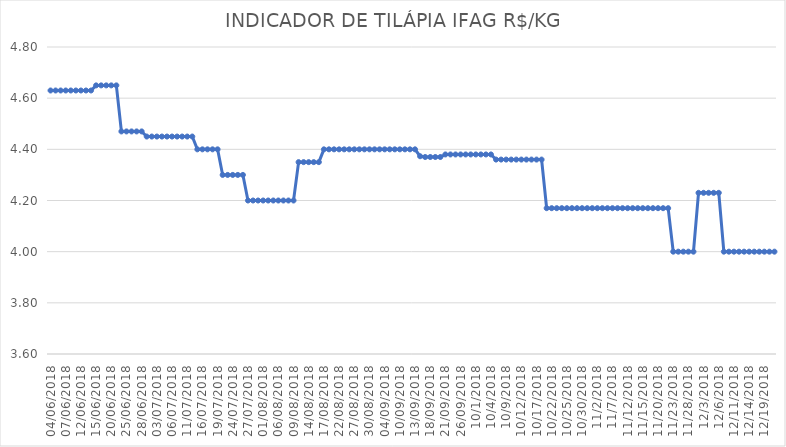
| Category | INDICADOR DE TILÁPIA IFAG |
|---|---|
| 04/06/2018 | 4.63 |
| 05/06/2018 | 4.63 |
| 06/06/2018 | 4.63 |
| 07/06/2018 | 4.63 |
| 08/06/2018 | 4.63 |
| 11/06/2018 | 4.63 |
| 12/06/2018 | 4.63 |
| 13/06/2018 | 4.63 |
| 14/06/2018 | 4.63 |
| 15/06/2018 | 4.65 |
| 18/06/2018 | 4.65 |
| 19/06/2018 | 4.65 |
| 20/06/2018 | 4.65 |
| 21/06/2018 | 4.65 |
| 22/06/2018 | 4.47 |
| 25/06/2018 | 4.47 |
| 26/06/2018 | 4.47 |
| 27/06/2018 | 4.47 |
| 28/06/2018 | 4.47 |
| 29/06/2018 | 4.45 |
| 02/07/2018 | 4.45 |
| 03/07/2018 | 4.45 |
| 04/07/2018 | 4.45 |
| 05/07/2018 | 4.45 |
| 06/07/2018 | 4.45 |
| 09/07/2018 | 4.45 |
| 10/07/2018 | 4.45 |
| 11/07/2018 | 4.45 |
| 12/07/2018 | 4.45 |
| 13/07/2018 | 4.4 |
| 16/07/2018 | 4.4 |
| 17/07/2018 | 4.4 |
| 18/07/2018 | 4.4 |
| 19/07/2018 | 4.4 |
| 20/07/2018 | 4.3 |
| 23/07/2018 | 4.3 |
| 24/07/2018 | 4.3 |
| 25/07/2018 | 4.3 |
| 26/07/2018 | 4.3 |
| 27/07/2018 | 4.2 |
| 30/07/2018 | 4.2 |
| 31/07/2018 | 4.2 |
| 01/08/2018 | 4.2 |
| 02/08/2018 | 4.2 |
| 03/08/2018 | 4.2 |
| 06/08/2018 | 4.2 |
| 07/08/2018 | 4.2 |
| 08/08/2018 | 4.2 |
| 09/08/2018 | 4.2 |
| 10/08/2018 | 4.35 |
| 13/08/2018 | 4.35 |
| 14/08/2018 | 4.35 |
| 15/08/2018 | 4.35 |
| 16/08/2018 | 4.35 |
| 17/08/2018 | 4.4 |
| 20/08/2018 | 4.4 |
| 21/08/2018 | 4.4 |
| 22/08/2018 | 4.4 |
| 23/08/2018 | 4.4 |
| 24/08/2018 | 4.4 |
| 27/08/2018 | 4.4 |
| 28/08/2018 | 4.4 |
| 29/08/2018 | 4.4 |
| 30/08/2018 | 4.4 |
| 31/08/2018 | 4.4 |
| 03/09/2018 | 4.4 |
| 04/09/2018 | 4.4 |
| 05/09/2018 | 4.4 |
| 06/09/2018 | 4.4 |
| 10/09/2018 | 4.4 |
| 11/09/2018 | 4.4 |
| 12/09/2018 | 4.4 |
| 13/09/2018 | 4.4 |
| 14/09/2018 | 4.373 |
| 17/09/2018 | 4.37 |
| 18/09/2018 | 4.37 |
| 19/09/2018 | 4.37 |
| 20/09/2018 | 4.37 |
| 21/09/2018 | 4.38 |
| 24/09/2018 | 4.38 |
| 25/09/2018 | 4.38 |
| 26/09/2018 | 4.38 |
| 27/09/2018 | 4.38 |
| 28/09/2018 | 4.38 |
| 01/10/2018 | 4.38 |
| 02/10/2018 | 4.38 |
| 03/10/2018 | 4.38 |
| 04/10/2018 | 4.38 |
| 05/10/2018 | 4.36 |
| 08/10/2018 | 4.36 |
| 09/10/2018 | 4.36 |
| 10/10/2018 | 4.36 |
| 11/10/2018 | 4.36 |
| 12/10/2018 | 4.36 |
| 15/10/2018 | 4.36 |
| 16/10/2018 | 4.36 |
| 17/10/2018 | 4.36 |
| 18/10/2018 | 4.36 |
| 19/10/2018 | 4.17 |
| 22/10/2018 | 4.17 |
| 23/10/2018 | 4.17 |
| 24/10/2018 | 4.17 |
| 25/10/2018 | 4.17 |
| 26/10/2018 | 4.17 |
| 29/10/2018 | 4.17 |
| 30/10/2018 | 4.17 |
| 31/10/2018 | 4.17 |
| 01/11/2018 | 4.17 |
| 02/11/2018 | 4.17 |
| 05/11/2018 | 4.17 |
| 06/11/2018 | 4.17 |
| 07/11/2018 | 4.17 |
| 08/11/2018 | 4.17 |
| 09/11/2018 | 4.17 |
| 12/11/2018 | 4.17 |
| 13/11/2018 | 4.17 |
| 14/11/2018 | 4.17 |
| 15/11/2018 | 4.17 |
| 16/11/2018 | 4.17 |
| 19/11/2018 | 4.17 |
| 20/11/2018 | 4.17 |
| 21/11/2018 | 4.17 |
| 22/11/2018 | 4.17 |
| 23/11/2018 | 4 |
| 26/11/2018 | 4 |
| 27/11/2018 | 4 |
| 28/11/2018 | 4 |
| 29/11/2018 | 4 |
| 30/11/2018 | 4.23 |
| 03/12/2018 | 4.23 |
| 04/12/2018 | 4.23 |
| 05/12/2018 | 4.23 |
| 06/12/2018 | 4.23 |
| 07/12/2018 | 4 |
| 10/12/2018 | 4 |
| 11/12/2018 | 4 |
| 12/12/2018 | 4 |
| 13/12/2018 | 4 |
| 14/12/2018 | 4 |
| 17/12/2018 | 4 |
| 18/12/2018 | 4 |
| 19/12/2018 | 4 |
| 20/12/2018 | 4 |
| 21/12/2018 | 4 |